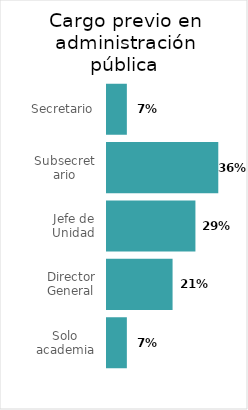
| Category | Series 1 |
|---|---|
| Solo academia | 0.071 |
| Director General | 0.214 |
| Jefe de Unidad | 0.286 |
| Subsecretario | 0.357 |
| Secretario | 0.071 |